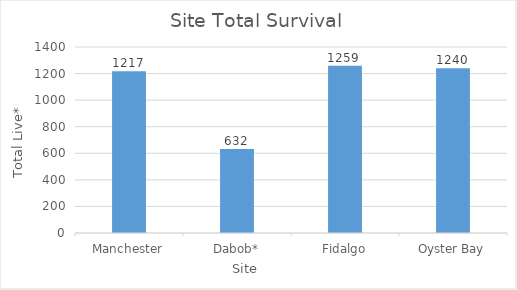
| Category | Site Total Survival |
|---|---|
| Manchester | 1217 |
| Dabob* | 632 |
| Fidalgo | 1259 |
| Oyster Bay | 1240 |